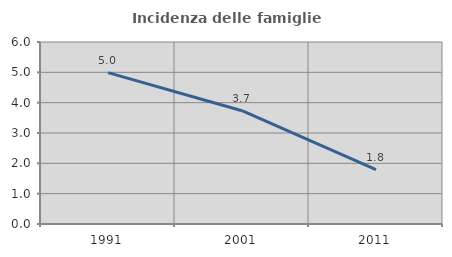
| Category | Incidenza delle famiglie numerose |
|---|---|
| 1991.0 | 4.99 |
| 2001.0 | 3.735 |
| 2011.0 | 1.791 |